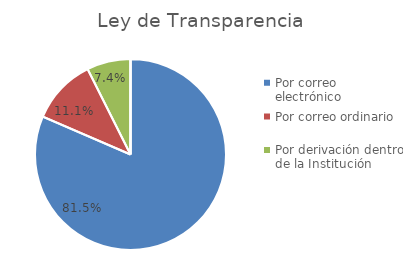
| Category | Series 0 |
|---|---|
| Por correo electrónico  | 22 |
| Por correo ordinario | 3 |
| Por derivación dentro de la Institución | 2 |
| Por FAX | 0 |
| Por presentación personal en registro | 0 |